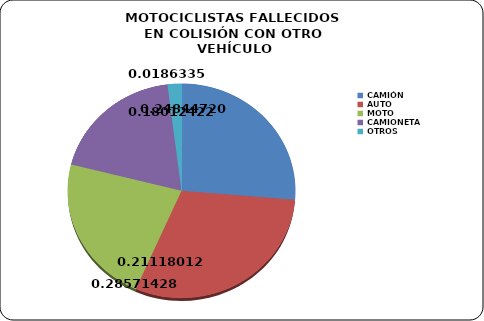
| Category | Series 0 |
|---|---|
| CAMIÓN | 0.248 |
| AUTO | 0.286 |
| MOTO | 0.211 |
| CAMIONETA | 0.18 |
| OTROS | 0.019 |